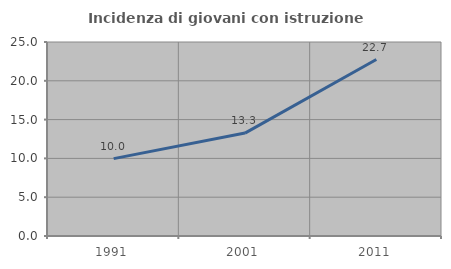
| Category | Incidenza di giovani con istruzione universitaria |
|---|---|
| 1991.0 | 9.972 |
| 2001.0 | 13.263 |
| 2011.0 | 22.742 |